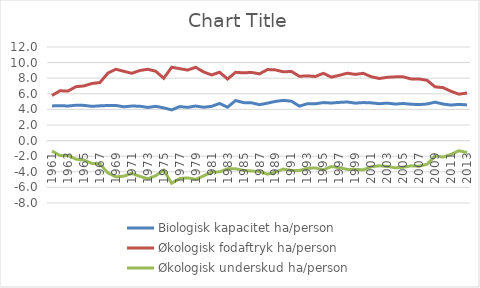
| Category | Biologisk kapacitet ha/person | Økologisk fodaftryk ha/person | Økologisk underskud ha/person |
|---|---|---|---|
| 1961.0 | 4.445 | 5.781 | -1.336 |
| 1962.0 | 4.478 | 6.387 | -1.908 |
| 1963.0 | 4.436 | 6.351 | -1.915 |
| 1964.0 | 4.536 | 6.911 | -2.375 |
| 1965.0 | 4.514 | 7.006 | -2.492 |
| 1966.0 | 4.393 | 7.319 | -2.925 |
| 1967.0 | 4.455 | 7.444 | -2.988 |
| 1968.0 | 4.502 | 8.644 | -4.142 |
| 1969.0 | 4.505 | 9.151 | -4.645 |
| 1970.0 | 4.331 | 8.886 | -4.555 |
| 1971.0 | 4.43 | 8.629 | -4.2 |
| 1972.0 | 4.41 | 8.986 | -4.576 |
| 1973.0 | 4.254 | 9.147 | -4.894 |
| 1974.0 | 4.393 | 8.892 | -4.499 |
| 1975.0 | 4.194 | 7.993 | -3.799 |
| 1976.0 | 3.936 | 9.405 | -5.469 |
| 1977.0 | 4.36 | 9.223 | -4.863 |
| 1978.0 | 4.262 | 9.042 | -4.78 |
| 1979.0 | 4.429 | 9.401 | -4.972 |
| 1980.0 | 4.276 | 8.801 | -4.525 |
| 1981.0 | 4.392 | 8.42 | -4.028 |
| 1982.0 | 4.761 | 8.767 | -4.006 |
| 1983.0 | 4.286 | 7.892 | -3.606 |
| 1984.0 | 5.138 | 8.758 | -3.62 |
| 1985.0 | 4.87 | 8.687 | -3.818 |
| 1986.0 | 4.847 | 8.741 | -3.894 |
| 1987.0 | 4.602 | 8.557 | -3.954 |
| 1988.0 | 4.8 | 9.109 | -4.309 |
| 1989.0 | 5.026 | 9.066 | -4.04 |
| 1990.0 | 5.158 | 8.812 | -3.654 |
| 1991.0 | 5.052 | 8.871 | -3.819 |
| 1992.0 | 4.419 | 8.24 | -3.822 |
| 1993.0 | 4.733 | 8.3 | -3.567 |
| 1994.0 | 4.723 | 8.221 | -3.498 |
| 1995.0 | 4.874 | 8.627 | -3.753 |
| 1996.0 | 4.817 | 8.137 | -3.32 |
| 1997.0 | 4.898 | 8.37 | -3.472 |
| 1998.0 | 4.95 | 8.643 | -3.693 |
| 1999.0 | 4.802 | 8.49 | -3.687 |
| 2000.0 | 4.875 | 8.624 | -3.749 |
| 2001.0 | 4.838 | 8.19 | -3.352 |
| 2002.0 | 4.729 | 7.96 | -3.23 |
| 2003.0 | 4.808 | 8.114 | -3.306 |
| 2004.0 | 4.684 | 8.171 | -3.486 |
| 2005.0 | 4.758 | 8.174 | -3.416 |
| 2006.0 | 4.664 | 7.9 | -3.236 |
| 2007.0 | 4.616 | 7.901 | -3.285 |
| 2008.0 | 4.697 | 7.728 | -3.03 |
| 2009.0 | 4.923 | 6.89 | -1.967 |
| 2010.0 | 4.685 | 6.791 | -2.106 |
| 2011.0 | 4.559 | 6.321 | -1.762 |
| 2012.0 | 4.646 | 5.949 | -1.303 |
| 2013.0 | 4.574 | 6.108 | -1.535 |